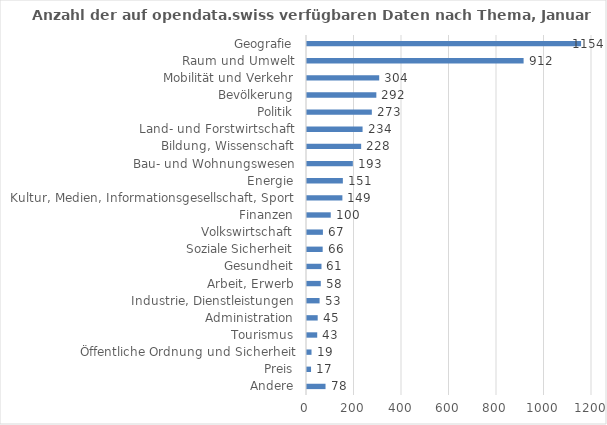
| Category | 2018 |
|---|---|
| Andere | 78 |
| Preis | 17 |
| Öffentliche Ordnung und Sicherheit | 19 |
| Tourismus | 43 |
| Administration | 45 |
| Industrie, Dienstleistungen | 53 |
| Arbeit, Erwerb | 58 |
| Gesundheit | 61 |
| Soziale Sicherheit | 66 |
| Volkswirtschaft | 67 |
| Finanzen | 100 |
| Kultur, Medien, Informationsgesellschaft, Sport | 149 |
| Energie | 151 |
| Bau- und Wohnungswesen | 193 |
| Bildung, Wissenschaft | 228 |
| Land- und Forstwirtschaft | 234 |
| Politik | 273 |
| Bevölkerung | 292 |
| Mobilität und Verkehr | 304 |
| Raum und Umwelt | 912 |
| Geografie | 1154 |